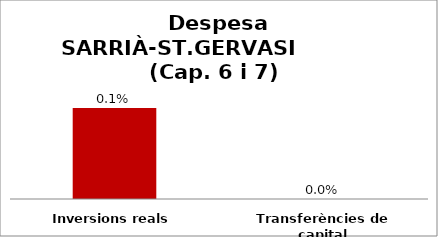
| Category | Series 0 |
|---|---|
| Inversions reals | 0.001 |
| Transferències de capital | 0 |